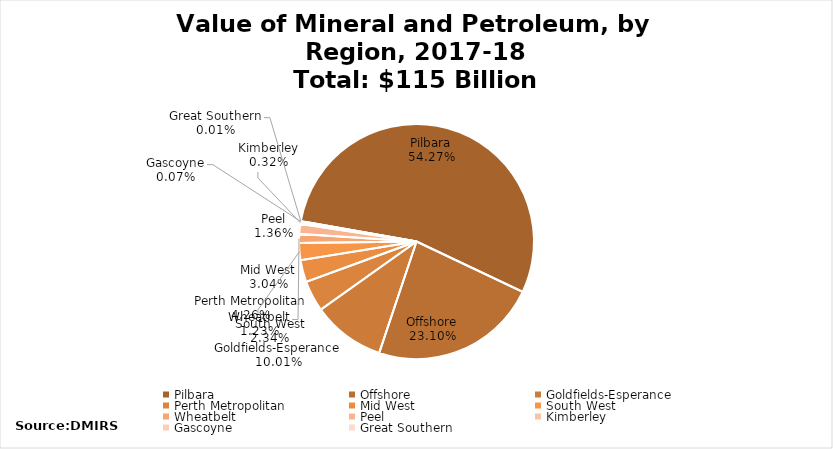
| Category | Value of Minerals and Petroleum in WA by Region |
|---|---|
| Pilbara | 62381723602.496 |
| Offshore | 26549261134.358 |
| Goldfields-Esperance | 11504899684.14 |
| Perth Metropolitan | 4897863454.987 |
| Mid West | 3496429410.336 |
| South West | 2691937984.63 |
| Wheatbelt | 1416297091.253 |
| Peel | 1556308032 |
| Kimberley | 363732094.64 |
| Gascoyne | 83861349.457 |
| Great Southern | 8063838 |